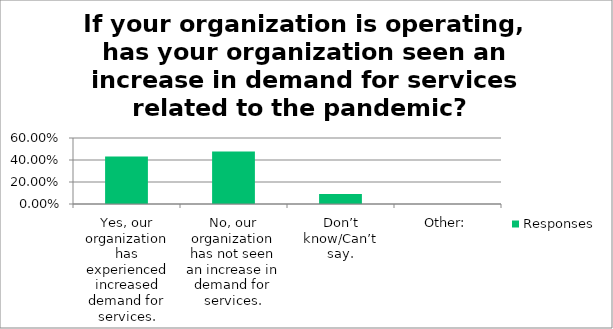
| Category | Responses |
|---|---|
| Yes, our organization has experienced increased demand for services. | 0.432 |
| No, our organization has not seen an increase in demand for services. | 0.477 |
| Don’t know/Can’t say. | 0.092 |
| Other: | 0 |